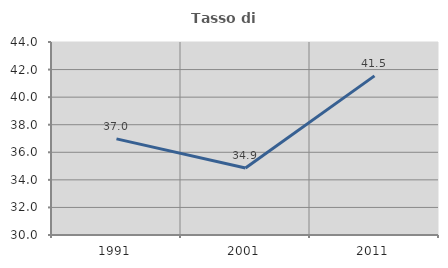
| Category | Tasso di occupazione   |
|---|---|
| 1991.0 | 36.973 |
| 2001.0 | 34.858 |
| 2011.0 | 41.542 |